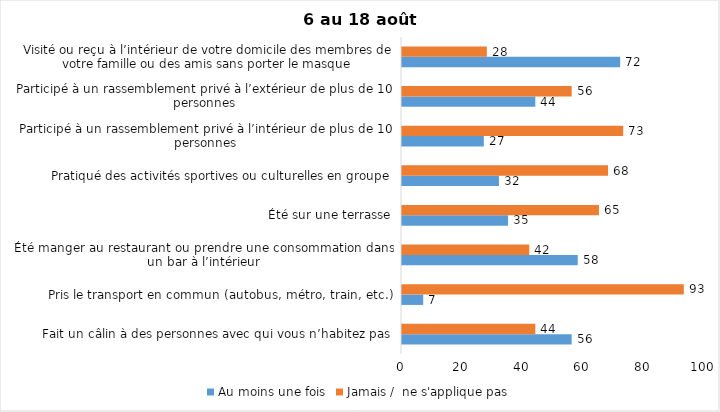
| Category | Au moins une fois | Jamais /  ne s'applique pas |
|---|---|---|
| Fait un câlin à des personnes avec qui vous n’habitez pas | 56 | 44 |
| Pris le transport en commun (autobus, métro, train, etc.) | 7 | 93 |
| Été manger au restaurant ou prendre une consommation dans un bar à l’intérieur | 58 | 42 |
| Été sur une terrasse | 35 | 65 |
| Pratiqué des activités sportives ou culturelles en groupe | 32 | 68 |
| Participé à un rassemblement privé à l’intérieur de plus de 10 personnes | 27 | 73 |
| Participé à un rassemblement privé à l’extérieur de plus de 10 personnes | 44 | 56 |
| Visité ou reçu à l’intérieur de votre domicile des membres de votre famille ou des amis sans porter le masque | 72 | 28 |